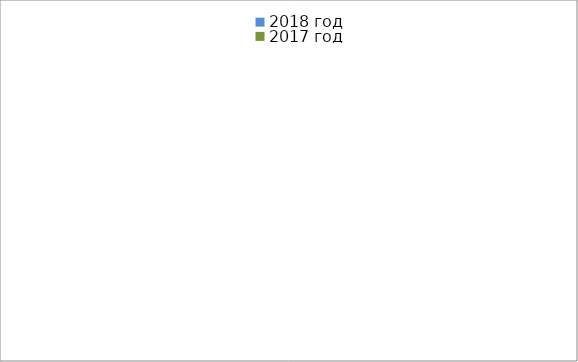
| Category | 2018 год | 2017 год |
|---|---|---|
|  - поджог | 17 | 23 |
|  - неосторожное обращение с огнём | 16 | 6 |
|  - НПТЭ электрооборудования | 21 | 26 |
|  - НПУ и Э печей | 77 | 61 |
|  - НПУ и Э транспортных средств | 55 | 49 |
|   -Шалость с огнем детей | 5 | 4 |
|  -НППБ при эксплуатации эл.приборов | 25 | 37 |
|  - курение | 35 | 50 |
| - прочие | 70 | 73 |
| - не установленные причины | 0 | 0 |